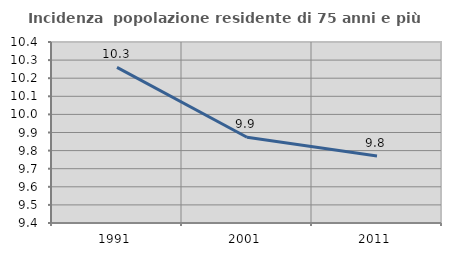
| Category | Incidenza  popolazione residente di 75 anni e più |
|---|---|
| 1991.0 | 10.26 |
| 2001.0 | 9.874 |
| 2011.0 | 9.771 |